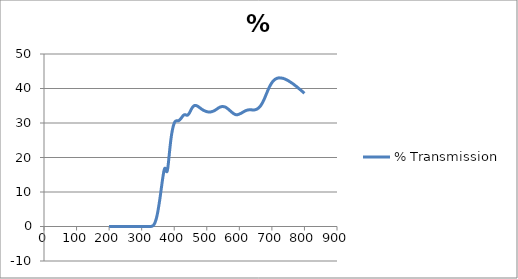
| Category | % Transmission |
|---|---|
| 800.0 | 38.616 |
| 799.0 | 38.694 |
| 798.0 | 38.78 |
| 797.0 | 38.863 |
| 796.0 | 38.935 |
| 795.0 | 39.027 |
| 794.0 | 39.128 |
| 793.0 | 39.187 |
| 792.0 | 39.267 |
| 791.0 | 39.346 |
| 790.0 | 39.418 |
| 789.0 | 39.522 |
| 788.0 | 39.607 |
| 787.0 | 39.661 |
| 786.0 | 39.758 |
| 785.0 | 39.836 |
| 784.0 | 39.894 |
| 783.0 | 39.985 |
| 782.0 | 40.076 |
| 781.0 | 40.138 |
| 780.0 | 40.22 |
| 779.0 | 40.307 |
| 778.0 | 40.365 |
| 777.0 | 40.471 |
| 776.0 | 40.556 |
| 775.0 | 40.611 |
| 774.0 | 40.694 |
| 773.0 | 40.769 |
| 772.0 | 40.819 |
| 771.0 | 40.9 |
| 770.0 | 40.99 |
| 769.0 | 41.044 |
| 768.0 | 41.125 |
| 767.0 | 41.2 |
| 766.0 | 41.258 |
| 765.0 | 41.332 |
| 764.0 | 41.416 |
| 763.0 | 41.472 |
| 762.0 | 41.538 |
| 761.0 | 41.6 |
| 760.0 | 41.645 |
| 759.0 | 41.732 |
| 758.0 | 41.806 |
| 757.0 | 41.85 |
| 756.0 | 41.919 |
| 755.0 | 41.989 |
| 754.0 | 42.015 |
| 753.0 | 42.094 |
| 752.0 | 42.169 |
| 751.0 | 42.204 |
| 750.0 | 42.27 |
| 749.0 | 42.327 |
| 748.0 | 42.351 |
| 747.0 | 42.434 |
| 746.0 | 42.492 |
| 745.0 | 42.529 |
| 744.0 | 42.563 |
| 743.0 | 42.627 |
| 742.0 | 42.652 |
| 741.0 | 42.696 |
| 740.0 | 42.742 |
| 739.0 | 42.779 |
| 738.0 | 42.825 |
| 737.0 | 42.857 |
| 736.0 | 42.874 |
| 735.0 | 42.924 |
| 734.0 | 42.945 |
| 733.0 | 42.99 |
| 732.0 | 42.995 |
| 731.0 | 43.008 |
| 730.0 | 42.999 |
| 729.0 | 43.059 |
| 728.0 | 43.076 |
| 727.0 | 43.059 |
| 726.0 | 43.079 |
| 725.0 | 43.068 |
| 724.0 | 43.062 |
| 723.0 | 43.083 |
| 722.0 | 43.097 |
| 721.0 | 43.065 |
| 720.0 | 43.06 |
| 719.0 | 43.038 |
| 718.0 | 42.995 |
| 717.0 | 42.992 |
| 716.0 | 42.961 |
| 715.0 | 42.905 |
| 714.0 | 42.882 |
| 713.0 | 42.835 |
| 712.0 | 42.761 |
| 711.0 | 42.739 |
| 710.0 | 42.688 |
| 709.0 | 42.578 |
| 708.0 | 42.533 |
| 707.0 | 42.446 |
| 706.0 | 42.339 |
| 705.0 | 42.269 |
| 704.0 | 42.172 |
| 703.0 | 42.039 |
| 702.0 | 41.938 |
| 701.0 | 41.824 |
| 700.0 | 41.67 |
| 699.0 | 41.551 |
| 698.0 | 41.411 |
| 697.0 | 41.231 |
| 696.0 | 41.076 |
| 695.0 | 40.911 |
| 694.0 | 40.717 |
| 693.0 | 40.564 |
| 692.0 | 40.377 |
| 691.0 | 40.155 |
| 690.0 | 39.975 |
| 689.0 | 39.758 |
| 688.0 | 39.515 |
| 687.0 | 39.325 |
| 686.0 | 39.093 |
| 685.0 | 38.838 |
| 684.0 | 38.623 |
| 683.0 | 38.41 |
| 682.0 | 38.158 |
| 681.0 | 37.958 |
| 680.0 | 37.724 |
| 679.0 | 37.465 |
| 678.0 | 37.247 |
| 677.0 | 37.029 |
| 676.0 | 36.799 |
| 675.0 | 36.619 |
| 674.0 | 36.424 |
| 673.0 | 36.215 |
| 672.0 | 36.041 |
| 671.0 | 35.87 |
| 670.0 | 35.681 |
| 669.0 | 35.537 |
| 668.0 | 35.387 |
| 667.0 | 35.223 |
| 666.0 | 35.094 |
| 665.0 | 34.959 |
| 664.0 | 34.83 |
| 663.0 | 34.735 |
| 662.0 | 34.635 |
| 661.0 | 34.528 |
| 660.0 | 34.452 |
| 659.0 | 34.368 |
| 658.0 | 34.27 |
| 657.0 | 34.223 |
| 656.0 | 34.151 |
| 655.0 | 34.074 |
| 654.0 | 34.035 |
| 653.0 | 33.993 |
| 652.0 | 33.934 |
| 651.0 | 33.927 |
| 650.0 | 33.889 |
| 649.0 | 33.845 |
| 648.0 | 33.822 |
| 647.0 | 33.809 |
| 646.0 | 33.783 |
| 645.0 | 33.8 |
| 644.0 | 33.793 |
| 643.0 | 33.773 |
| 642.0 | 33.779 |
| 641.0 | 33.784 |
| 640.0 | 33.776 |
| 639.0 | 33.808 |
| 638.0 | 33.807 |
| 637.0 | 33.802 |
| 636.0 | 33.814 |
| 635.0 | 33.814 |
| 634.0 | 33.81 |
| 633.0 | 33.84 |
| 632.0 | 33.838 |
| 631.0 | 33.817 |
| 630.0 | 33.821 |
| 629.0 | 33.812 |
| 628.0 | 33.793 |
| 627.0 | 33.799 |
| 626.0 | 33.777 |
| 625.0 | 33.736 |
| 624.0 | 33.727 |
| 623.0 | 33.697 |
| 622.0 | 33.656 |
| 621.0 | 33.635 |
| 620.0 | 33.606 |
| 619.0 | 33.543 |
| 618.0 | 33.512 |
| 617.0 | 33.47 |
| 616.0 | 33.388 |
| 615.0 | 33.349 |
| 614.0 | 33.295 |
| 613.0 | 33.228 |
| 612.0 | 33.191 |
| 611.0 | 33.136 |
| 610.0 | 33.07 |
| 609.0 | 33.032 |
| 608.0 | 32.977 |
| 607.0 | 32.907 |
| 606.0 | 32.866 |
| 605.0 | 32.812 |
| 604.0 | 32.751 |
| 603.0 | 32.724 |
| 602.0 | 32.681 |
| 601.0 | 32.628 |
| 600.0 | 32.589 |
| 599.0 | 32.542 |
| 598.0 | 32.5 |
| 597.0 | 32.481 |
| 596.0 | 32.453 |
| 595.0 | 32.411 |
| 594.0 | 32.41 |
| 593.0 | 32.393 |
| 592.0 | 32.379 |
| 591.0 | 32.399 |
| 590.0 | 32.408 |
| 589.0 | 32.418 |
| 588.0 | 32.455 |
| 587.0 | 32.486 |
| 586.0 | 32.523 |
| 585.0 | 32.58 |
| 584.0 | 32.632 |
| 583.0 | 32.678 |
| 582.0 | 32.751 |
| 581.0 | 32.808 |
| 580.0 | 32.871 |
| 579.0 | 32.956 |
| 578.0 | 33.037 |
| 577.0 | 33.103 |
| 576.0 | 33.197 |
| 575.0 | 33.272 |
| 574.0 | 33.352 |
| 573.0 | 33.452 |
| 572.0 | 33.527 |
| 571.0 | 33.599 |
| 570.0 | 33.698 |
| 569.0 | 33.775 |
| 568.0 | 33.852 |
| 567.0 | 33.948 |
| 566.0 | 34.021 |
| 565.0 | 34.089 |
| 564.0 | 34.169 |
| 563.0 | 34.228 |
| 562.0 | 34.297 |
| 561.0 | 34.388 |
| 560.0 | 34.441 |
| 559.0 | 34.509 |
| 558.0 | 34.558 |
| 557.0 | 34.593 |
| 556.0 | 34.641 |
| 555.0 | 34.664 |
| 554.0 | 34.688 |
| 553.0 | 34.727 |
| 552.0 | 34.739 |
| 551.0 | 34.743 |
| 550.0 | 34.764 |
| 549.0 | 34.758 |
| 548.0 | 34.754 |
| 547.0 | 34.773 |
| 546.0 | 34.749 |
| 545.0 | 34.716 |
| 544.0 | 34.707 |
| 543.0 | 34.676 |
| 542.0 | 34.644 |
| 541.0 | 34.626 |
| 540.0 | 34.578 |
| 539.0 | 34.52 |
| 538.0 | 34.476 |
| 537.0 | 34.41 |
| 536.0 | 34.352 |
| 535.0 | 34.314 |
| 534.0 | 34.241 |
| 533.0 | 34.164 |
| 532.0 | 34.112 |
| 531.0 | 34.038 |
| 530.0 | 33.973 |
| 529.0 | 33.919 |
| 528.0 | 33.851 |
| 527.0 | 33.781 |
| 526.0 | 33.731 |
| 525.0 | 33.669 |
| 524.0 | 33.614 |
| 523.0 | 33.581 |
| 522.0 | 33.526 |
| 521.0 | 33.477 |
| 520.0 | 33.445 |
| 519.0 | 33.399 |
| 518.0 | 33.364 |
| 517.0 | 33.343 |
| 516.0 | 33.308 |
| 515.0 | 33.274 |
| 514.0 | 33.253 |
| 513.0 | 33.226 |
| 512.0 | 33.21 |
| 511.0 | 33.211 |
| 510.0 | 33.191 |
| 509.0 | 33.177 |
| 508.0 | 33.185 |
| 507.0 | 33.178 |
| 506.0 | 33.189 |
| 505.0 | 33.215 |
| 504.0 | 33.22 |
| 503.0 | 33.233 |
| 502.0 | 33.26 |
| 501.0 | 33.274 |
| 500.0 | 33.301 |
| 499.0 | 33.341 |
| 498.0 | 33.363 |
| 497.0 | 33.392 |
| 496.0 | 33.434 |
| 495.0 | 33.458 |
| 494.0 | 33.499 |
| 493.0 | 33.554 |
| 492.0 | 33.584 |
| 491.0 | 33.628 |
| 490.0 | 33.685 |
| 489.0 | 33.722 |
| 488.0 | 33.785 |
| 487.0 | 33.862 |
| 486.0 | 33.91 |
| 485.0 | 33.969 |
| 484.0 | 34.042 |
| 483.0 | 34.104 |
| 482.0 | 34.175 |
| 481.0 | 34.259 |
| 480.0 | 34.321 |
| 479.0 | 34.39 |
| 478.0 | 34.465 |
| 477.0 | 34.523 |
| 476.0 | 34.603 |
| 475.0 | 34.686 |
| 474.0 | 34.734 |
| 473.0 | 34.792 |
| 472.0 | 34.855 |
| 471.0 | 34.901 |
| 470.0 | 34.955 |
| 469.0 | 35.012 |
| 468.0 | 35.037 |
| 467.0 | 35.061 |
| 466.0 | 35.087 |
| 465.0 | 35.087 |
| 464.0 | 35.089 |
| 463.0 | 35.081 |
| 462.0 | 35.038 |
| 461.0 | 34.993 |
| 460.0 | 34.939 |
| 459.0 | 34.847 |
| 458.0 | 34.759 |
| 457.0 | 34.655 |
| 456.0 | 34.515 |
| 455.0 | 34.375 |
| 454.0 | 34.23 |
| 453.0 | 34.056 |
| 452.0 | 33.898 |
| 451.0 | 33.738 |
| 450.0 | 33.539 |
| 449.0 | 33.347 |
| 448.0 | 33.167 |
| 447.0 | 32.975 |
| 446.0 | 32.818 |
| 445.0 | 32.676 |
| 444.0 | 32.533 |
| 443.0 | 32.424 |
| 442.0 | 32.348 |
| 441.0 | 32.28 |
| 440.0 | 32.263 |
| 439.0 | 32.27 |
| 438.0 | 32.275 |
| 437.0 | 32.305 |
| 436.0 | 32.348 |
| 435.0 | 32.369 |
| 434.0 | 32.405 |
| 433.0 | 32.423 |
| 432.0 | 32.408 |
| 431.0 | 32.388 |
| 430.0 | 32.342 |
| 429.0 | 32.269 |
| 428.0 | 32.195 |
| 427.0 | 32.102 |
| 426.0 | 31.978 |
| 425.0 | 31.859 |
| 424.0 | 31.736 |
| 423.0 | 31.597 |
| 422.0 | 31.482 |
| 421.0 | 31.363 |
| 420.0 | 31.221 |
| 419.0 | 31.107 |
| 418.0 | 31.008 |
| 417.0 | 30.9 |
| 416.0 | 30.838 |
| 415.0 | 30.761 |
| 414.0 | 30.695 |
| 413.0 | 30.668 |
| 412.0 | 30.654 |
| 411.0 | 30.628 |
| 410.0 | 30.634 |
| 409.0 | 30.646 |
| 408.0 | 30.634 |
| 407.0 | 30.636 |
| 406.0 | 30.624 |
| 405.0 | 30.574 |
| 404.0 | 30.53 |
| 403.0 | 30.442 |
| 402.0 | 30.299 |
| 401.0 | 30.14 |
| 400.0 | 29.939 |
| 399.0 | 29.673 |
| 398.0 | 29.389 |
| 397.0 | 29.054 |
| 396.0 | 28.648 |
| 395.0 | 28.226 |
| 394.0 | 27.76 |
| 393.0 | 27.229 |
| 392.0 | 26.679 |
| 391.0 | 26.063 |
| 390.0 | 25.363 |
| 389.0 | 24.612 |
| 388.0 | 23.81 |
| 387.0 | 22.938 |
| 386.0 | 22.043 |
| 385.0 | 21.113 |
| 384.0 | 20.158 |
| 383.0 | 19.241 |
| 382.0 | 18.346 |
| 381.0 | 17.513 |
| 380.0 | 16.818 |
| 379.0 | 16.296 |
| 378.0 | 15.946 |
| 377.0 | 15.862 |
| 376.0 | 16.002 |
| 375.0 | 16.257 |
| 374.0 | 16.535 |
| 373.0 | 16.774 |
| 372.0 | 16.903 |
| 371.0 | 16.863 |
| 370.0 | 16.683 |
| 369.0 | 16.359 |
| 368.0 | 15.907 |
| 367.0 | 15.377 |
| 366.0 | 14.801 |
| 365.0 | 14.17 |
| 364.0 | 13.537 |
| 363.0 | 12.877 |
| 362.0 | 12.193 |
| 361.0 | 11.503 |
| 360.0 | 10.802 |
| 359.0 | 10.093 |
| 358.0 | 9.408 |
| 357.0 | 8.725 |
| 356.0 | 8.054 |
| 355.0 | 7.411 |
| 354.0 | 6.793 |
| 353.0 | 6.193 |
| 352.0 | 5.618 |
| 351.0 | 5.069 |
| 350.0 | 4.522 |
| 349.0 | 4.014 |
| 348.0 | 3.533 |
| 347.0 | 3.082 |
| 346.0 | 2.673 |
| 345.0 | 2.302 |
| 344.0 | 1.966 |
| 343.0 | 1.666 |
| 342.0 | 1.395 |
| 341.0 | 1.148 |
| 340.0 | 0.933 |
| 339.0 | 0.748 |
| 338.0 | 0.588 |
| 337.0 | 0.459 |
| 336.0 | 0.353 |
| 335.0 | 0.262 |
| 334.0 | 0.195 |
| 333.0 | 0.14 |
| 332.0 | 0.102 |
| 331.0 | 0.07 |
| 330.0 | 0.047 |
| 329.0 | 0.027 |
| 328.0 | 0.016 |
| 327.0 | 0.007 |
| 326.0 | 0.005 |
| 325.0 | 0.002 |
| 324.0 | 0.001 |
| 323.0 | -0.003 |
| 322.0 | -0.004 |
| 321.0 | 0 |
| 320.0 | -0.004 |
| 319.0 | 0 |
| 318.0 | -0.003 |
| 317.0 | -0.003 |
| 316.0 | -0.005 |
| 315.0 | 0 |
| 314.0 | -0.004 |
| 313.0 | 0.002 |
| 312.0 | -0.001 |
| 311.0 | -0.003 |
| 310.0 | -0.004 |
| 309.0 | 0.001 |
| 308.0 | -0.004 |
| 307.0 | 0.002 |
| 306.0 | -0.001 |
| 305.0 | -0.003 |
| 304.0 | -0.004 |
| 303.0 | 0.001 |
| 302.0 | -0.004 |
| 301.0 | 0 |
| 300.0 | 0 |
| 299.0 | -0.002 |
| 298.0 | -0.005 |
| 297.0 | -0.002 |
| 296.0 | -0.005 |
| 295.0 | 0.002 |
| 294.0 | 0 |
| 293.0 | -0.002 |
| 292.0 | -0.005 |
| 291.0 | -0.001 |
| 290.0 | -0.005 |
| 289.0 | 0.001 |
| 288.0 | 0 |
| 287.0 | -0.003 |
| 286.0 | -0.005 |
| 285.0 | -0.002 |
| 284.0 | -0.003 |
| 283.0 | 0.001 |
| 282.0 | 0 |
| 281.0 | -0.003 |
| 280.0 | -0.005 |
| 279.0 | -0.001 |
| 278.0 | -0.004 |
| 277.0 | 0.001 |
| 276.0 | 0 |
| 275.0 | -0.004 |
| 274.0 | -0.004 |
| 273.0 | -0.003 |
| 272.0 | -0.004 |
| 271.0 | 0.001 |
| 270.0 | 0 |
| 269.0 | -0.003 |
| 268.0 | -0.004 |
| 267.0 | -0.002 |
| 266.0 | -0.003 |
| 265.0 | 0 |
| 264.0 | -0.001 |
| 263.0 | -0.004 |
| 262.0 | -0.005 |
| 261.0 | -0.002 |
| 260.0 | -0.003 |
| 259.0 | 0 |
| 258.0 | -0.001 |
| 257.0 | -0.005 |
| 256.0 | -0.005 |
| 255.0 | -0.003 |
| 254.0 | -0.003 |
| 253.0 | 0 |
| 252.0 | 0 |
| 251.0 | -0.005 |
| 250.0 | -0.005 |
| 299.0 | -0.004 |
| 298.0 | -0.003 |
| 297.0 | 0 |
| 296.0 | 0.001 |
| 295.0 | -0.005 |
| 294.0 | -0.004 |
| 293.0 | -0.002 |
| 292.0 | -0.003 |
| 291.0 | 0 |
| 290.0 | -0.001 |
| 289.0 | -0.004 |
| 288.0 | -0.003 |
| 287.0 | -0.002 |
| 286.0 | -0.003 |
| 285.0 | -0.001 |
| 284.0 | 0 |
| 283.0 | -0.005 |
| 282.0 | -0.004 |
| 281.0 | -0.002 |
| 280.0 | -0.003 |
| 279.0 | 0 |
| 278.0 | 0 |
| 277.0 | -0.005 |
| 276.0 | -0.004 |
| 275.0 | -0.004 |
| 274.0 | -0.003 |
| 273.0 | -0.001 |
| 272.0 | -0.001 |
| 271.0 | -0.006 |
| 270.0 | -0.005 |
| 269.0 | -0.002 |
| 268.0 | -0.003 |
| 267.0 | 0 |
| 266.0 | -0.001 |
| 265.0 | -0.005 |
| 264.0 | -0.004 |
| 263.0 | -0.004 |
| 262.0 | -0.004 |
| 261.0 | -0.002 |
| 260.0 | -0.003 |
| 259.0 | -0.006 |
| 258.0 | -0.006 |
| 257.0 | -0.005 |
| 256.0 | -0.004 |
| 255.0 | -0.003 |
| 254.0 | -0.005 |
| 253.0 | -0.01 |
| 252.0 | -0.008 |
| 251.0 | -0.007 |
| 250.0 | -0.009 |
| 249.0 | 0.002 |
| 248.0 | 0 |
| 247.0 | 0 |
| 246.0 | 0.002 |
| 245.0 | -0.001 |
| 244.0 | -0.003 |
| 243.0 | -0.001 |
| 242.0 | -0.002 |
| 241.0 | 0 |
| 240.0 | 0.003 |
| 239.0 | 0 |
| 238.0 | -0.002 |
| 237.0 | -0.001 |
| 236.0 | -0.001 |
| 235.0 | 0 |
| 234.0 | 0.002 |
| 233.0 | 0 |
| 232.0 | -0.002 |
| 231.0 | 0.001 |
| 230.0 | -0.001 |
| 229.0 | 0 |
| 228.0 | 0.003 |
| 227.0 | 0.001 |
| 226.0 | -0.001 |
| 225.0 | -0.001 |
| 224.0 | -0.002 |
| 223.0 | 0 |
| 222.0 | 0.002 |
| 221.0 | 0.001 |
| 220.0 | -0.001 |
| 219.0 | 0 |
| 218.0 | -0.001 |
| 217.0 | 0 |
| 216.0 | 0.002 |
| 215.0 | 0 |
| 214.0 | -0.001 |
| 213.0 | 0 |
| 212.0 | -0.002 |
| 211.0 | 0.001 |
| 210.0 | 0.002 |
| 209.0 | 0 |
| 208.0 | -0.003 |
| 207.0 | 0.001 |
| 206.0 | 0 |
| 205.0 | -0.002 |
| 204.0 | 0 |
| 203.0 | -0.001 |
| 202.0 | 0 |
| 201.0 | 0 |
| 200.0 | -0.004 |